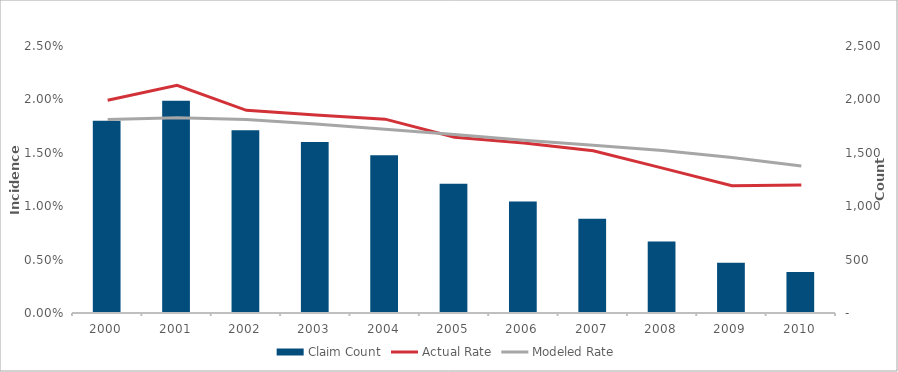
| Category | Claim Count |
|---|---|
| 2000.0 | 1801 |
| 2001.0 | 1987 |
| 2002.0 | 1712 |
| 2003.0 | 1602 |
| 2004.0 | 1476 |
| 2005.0 | 1211 |
| 2006.0 | 1045 |
| 2007.0 | 882 |
| 2008.0 | 670 |
| 2009.0 | 471 |
| 2010.0 | 385 |